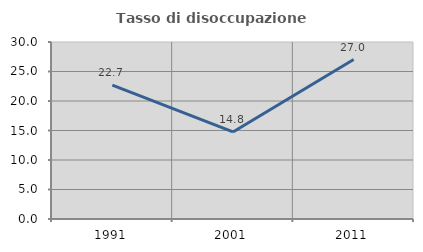
| Category | Tasso di disoccupazione giovanile  |
|---|---|
| 1991.0 | 22.68 |
| 2001.0 | 14.754 |
| 2011.0 | 27.027 |